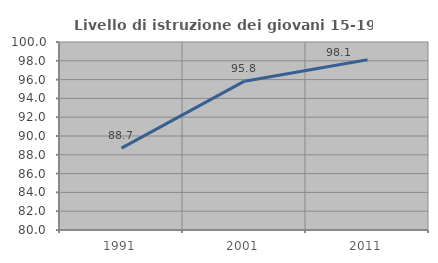
| Category | Livello di istruzione dei giovani 15-19 anni |
|---|---|
| 1991.0 | 88.71 |
| 2001.0 | 95.833 |
| 2011.0 | 98.113 |